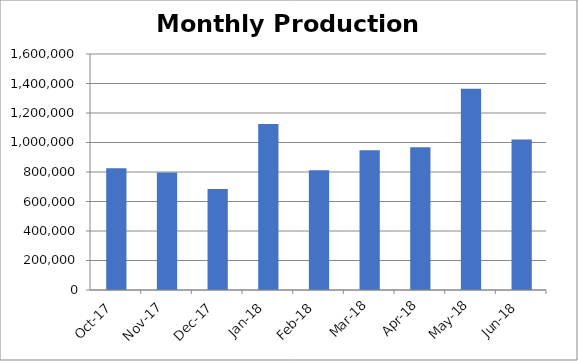
| Category | Series 0 |
|---|---|
| 2017-10-01 | 826096.917 |
| 2017-11-01 | 797045.5 |
| 2017-12-01 | 684479.122 |
| 2018-01-01 | 1125801.25 |
| 2018-02-01 | 812648.5 |
| 2018-03-01 | 947868 |
| 2018-04-01 | 967041 |
| 2018-05-01 | 1364954 |
| 2018-06-01 | 1019579 |